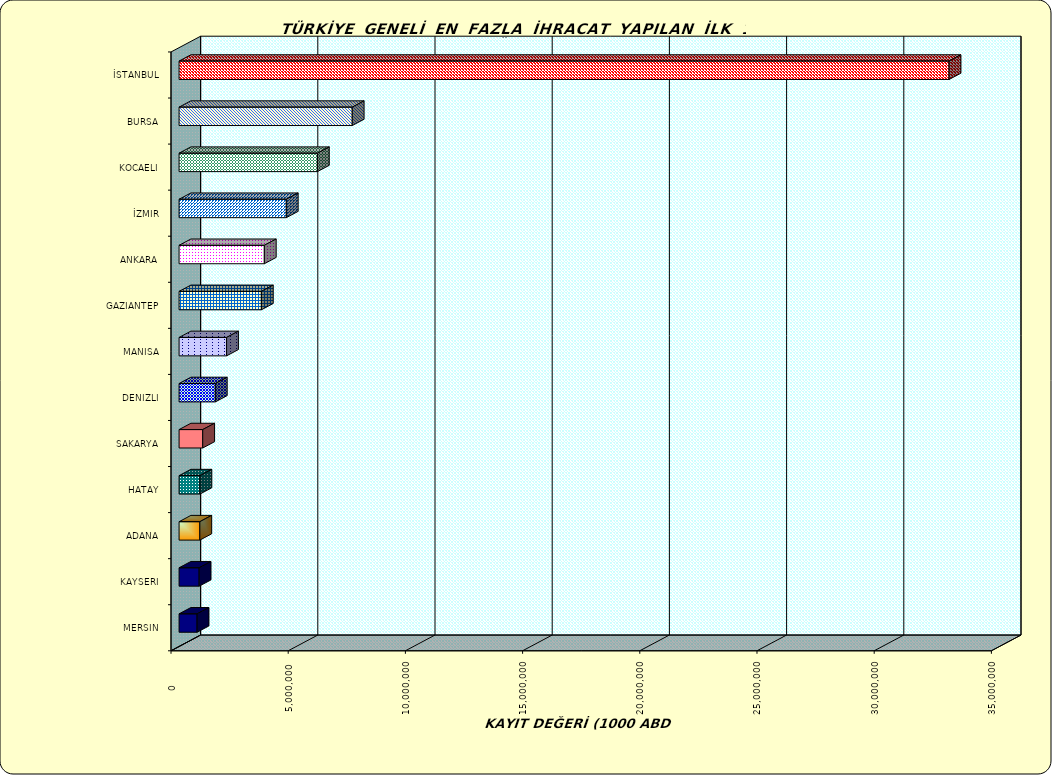
| Category | Series 0 |
|---|---|
| İSTANBUL | 32850234.321 |
| BURSA | 7388108.675 |
| KOCAELI | 5902030.277 |
| İZMIR | 4574819.094 |
| ANKARA | 3637070.794 |
| GAZIANTEP | 3511592.088 |
| MANISA | 2026797.133 |
| DENIZLI | 1546454.738 |
| SAKARYA | 1009003.946 |
| HATAY | 890305.549 |
| ADANA | 885820.631 |
| KAYSERI | 856059.632 |
| MERSIN | 768191.213 |